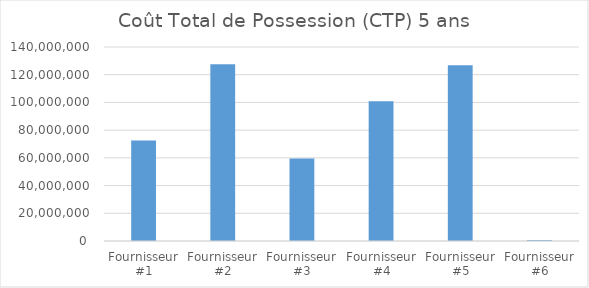
| Category | Coût Total de Possession (CTP) 5 ans |
|---|---|
| Fournisseur #1 | 72500000 |
| Fournisseur #2 | 127600000 |
| Fournisseur #3 | 59550000 |
| Fournisseur #4 | 100832026.211 |
| Fournisseur #5 | 126824103 |
| Fournisseur #6 | 668000 |